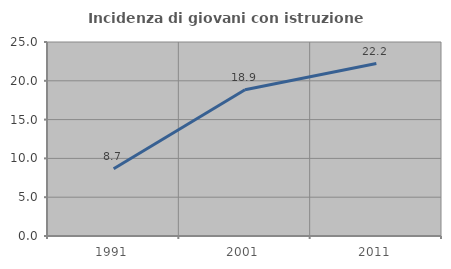
| Category | Incidenza di giovani con istruzione universitaria |
|---|---|
| 1991.0 | 8.671 |
| 2001.0 | 18.857 |
| 2011.0 | 22.222 |